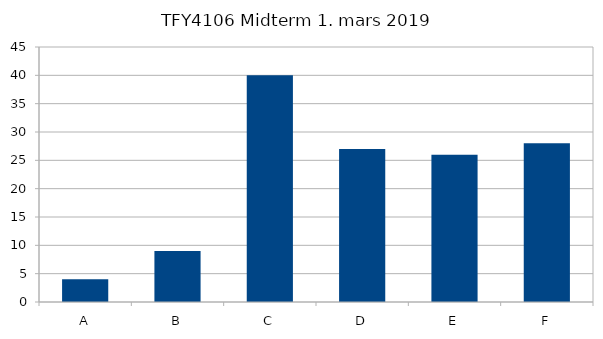
| Category | Series 0 |
|---|---|
| A | 4 |
| B | 9 |
| C | 40 |
| D | 27 |
| E | 26 |
| F | 28 |